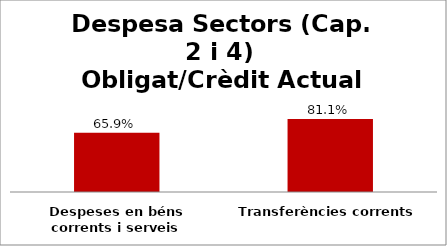
| Category | Series 0 |
|---|---|
| Despeses en béns corrents i serveis | 0.659 |
| Transferències corrents | 0.811 |